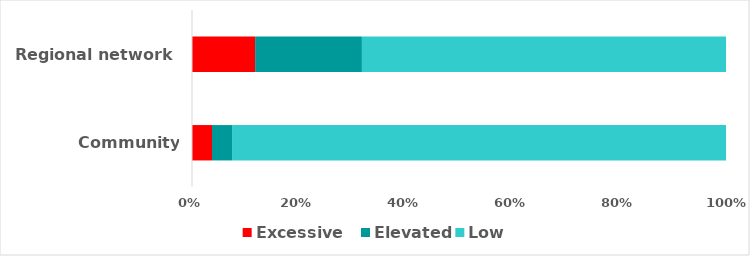
| Category | Excessive    | Elevated | Low |
|---|---|---|---|
| Community supplies | 3.75 | 3.75 | 92.5 |
| Regional network | 11.818 | 20 | 68.182 |